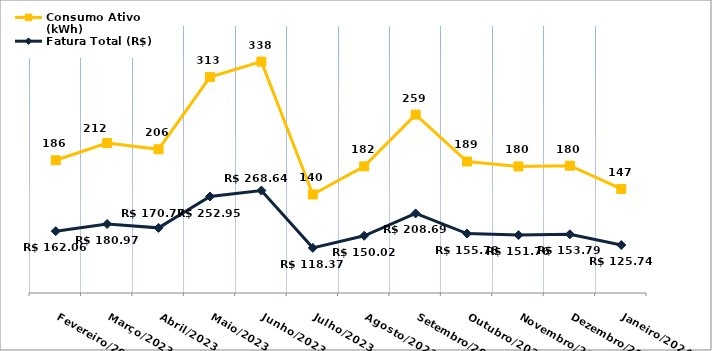
| Category | Fatura Total (R$) | Consumo Ativo (kWh) |
|---|---|---|
| Fevereiro/2023 | 162.06 | 186 |
| Março/2023 | 180.97 | 212 |
| Abril/2023 | 170.77 | 206 |
| Maio/2023 | 252.95 | 313 |
| Junho/2023 | 268.64 | 338 |
| Julho/2023 | 118.37 | 140 |
| Agosto/2023 | 150.02 | 182 |
| Setembro/2023 | 208.69 | 259 |
| Outubro/2023 | 155.78 | 189 |
| Novembro/2023 | 151.76 | 180 |
| Dezembro/2023 | 153.79 | 180 |
| Janeiro/2024 | 125.74 | 147 |